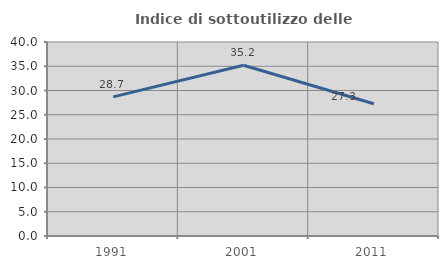
| Category | Indice di sottoutilizzo delle abitazioni  |
|---|---|
| 1991.0 | 28.682 |
| 2001.0 | 35.205 |
| 2011.0 | 27.256 |